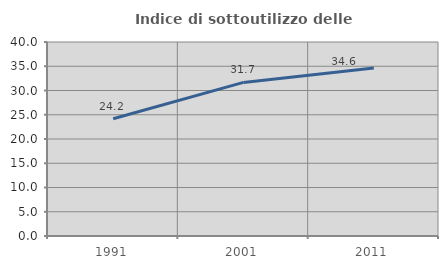
| Category | Indice di sottoutilizzo delle abitazioni  |
|---|---|
| 1991.0 | 24.161 |
| 2001.0 | 31.666 |
| 2011.0 | 34.619 |